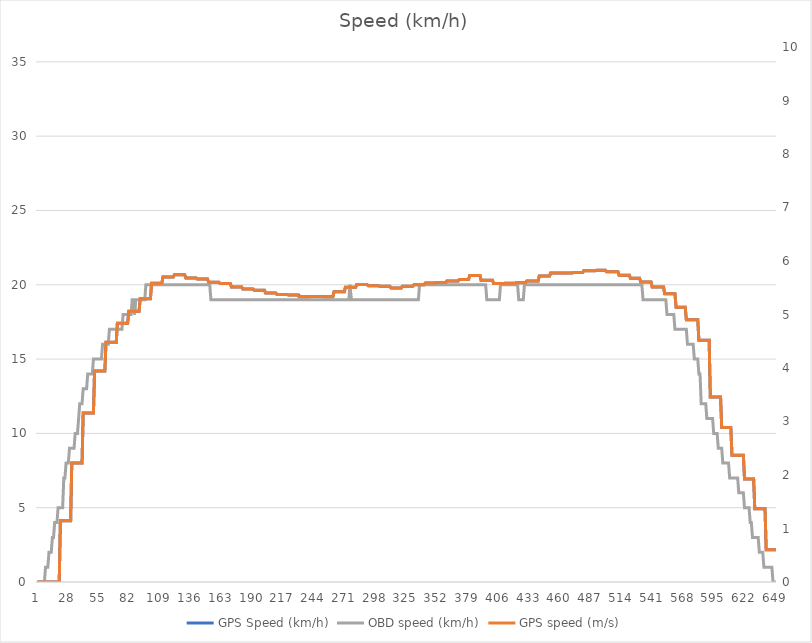
| Category | GPS Speed (km/h) | OBD speed (km/h) |
|---|---|---|
| 0 | 0 | 0 |
| 1 | 0 | 0 |
| 2 | 0 | 0 |
| 3 | 0 | 0 |
| 4 | 0 | 0 |
| 5 | 0 | 0 |
| 6 | 0 | 0 |
| 7 | 0 | 1 |
| 8 | 0 | 1 |
| 9 | 0 | 1 |
| 10 | 0 | 2 |
| 11 | 0 | 2 |
| 12 | 0 | 2 |
| 13 | 0 | 3 |
| 14 | 0 | 3 |
| 15 | 0 | 4 |
| 16 | 0 | 4 |
| 17 | 0 | 4 |
| 18 | 0 | 5 |
| 19 | 0 | 5 |
| 20 | 4.122 | 5 |
| 21 | 4.122 | 5 |
| 22 | 4.122 | 5 |
| 23 | 4.122 | 7 |
| 24 | 4.122 | 7 |
| 25 | 4.122 | 8 |
| 26 | 4.122 | 8 |
| 27 | 4.122 | 8 |
| 28 | 4.122 | 9 |
| 29 | 4.122 | 9 |
| 30 | 8.011 | 9 |
| 31 | 8.011 | 9 |
| 32 | 8.011 | 9 |
| 33 | 8.011 | 10 |
| 34 | 8.011 | 10 |
| 35 | 8.011 | 10 |
| 36 | 8.011 | 11 |
| 37 | 8.011 | 12 |
| 38 | 8.011 | 12 |
| 39 | 8.011 | 12 |
| 40 | 11.367 | 13 |
| 41 | 11.367 | 13 |
| 42 | 11.367 | 13 |
| 43 | 11.367 | 13 |
| 44 | 11.367 | 14 |
| 45 | 11.367 | 14 |
| 46 | 11.367 | 14 |
| 47 | 11.367 | 14 |
| 48 | 11.367 | 14 |
| 49 | 11.367 | 15 |
| 50 | 14.2 | 15 |
| 51 | 14.2 | 15 |
| 52 | 14.2 | 15 |
| 53 | 14.2 | 15 |
| 54 | 14.2 | 15 |
| 55 | 14.2 | 15 |
| 56 | 14.2 | 15 |
| 57 | 14.2 | 16 |
| 58 | 14.2 | 16 |
| 59 | 14.2 | 16 |
| 60 | 16.129 | 16 |
| 61 | 16.129 | 16 |
| 62 | 16.129 | 16 |
| 63 | 16.129 | 17 |
| 64 | 16.129 | 17 |
| 65 | 16.129 | 17 |
| 66 | 16.129 | 17 |
| 67 | 16.129 | 17 |
| 68 | 16.129 | 17 |
| 69 | 16.129 | 17 |
| 70 | 17.41 | 17 |
| 71 | 17.41 | 17 |
| 72 | 17.41 | 17 |
| 73 | 17.41 | 17 |
| 74 | 17.41 | 17 |
| 75 | 17.41 | 18 |
| 76 | 17.41 | 18 |
| 77 | 17.41 | 18 |
| 78 | 17.41 | 18 |
| 79 | 17.41 | 18 |
| 80 | 18.217 | 18 |
| 81 | 18.217 | 18 |
| 82 | 18.217 | 18 |
| 83 | 18.217 | 19 |
| 84 | 18.217 | 19 |
| 85 | 18.217 | 18 |
| 86 | 18.217 | 19 |
| 87 | 18.217 | 19 |
| 88 | 18.217 | 19 |
| 89 | 18.217 | 19 |
| 90 | 19.066 | 19 |
| 91 | 19.066 | 19 |
| 92 | 19.066 | 19 |
| 93 | 19.066 | 19 |
| 94 | 19.066 | 19 |
| 95 | 19.066 | 20 |
| 96 | 19.066 | 20 |
| 97 | 19.066 | 20 |
| 98 | 19.066 | 20 |
| 99 | 19.066 | 20 |
| 100 | 20.11 | 20 |
| 101 | 20.11 | 20 |
| 102 | 20.11 | 20 |
| 103 | 20.11 | 20 |
| 104 | 20.11 | 20 |
| 105 | 20.11 | 20 |
| 106 | 20.11 | 20 |
| 107 | 20.11 | 20 |
| 108 | 20.11 | 20 |
| 109 | 20.11 | 20 |
| 110 | 20.525 | 20 |
| 111 | 20.525 | 20 |
| 112 | 20.525 | 20 |
| 113 | 20.525 | 20 |
| 114 | 20.525 | 20 |
| 115 | 20.525 | 20 |
| 116 | 20.525 | 20 |
| 117 | 20.525 | 20 |
| 118 | 20.525 | 20 |
| 119 | 20.525 | 20 |
| 120 | 20.676 | 20 |
| 121 | 20.676 | 20 |
| 122 | 20.676 | 20 |
| 123 | 20.676 | 20 |
| 124 | 20.676 | 20 |
| 125 | 20.676 | 20 |
| 126 | 20.676 | 20 |
| 127 | 20.676 | 20 |
| 128 | 20.676 | 20 |
| 129 | 20.676 | 20 |
| 130 | 20.462 | 20 |
| 131 | 20.462 | 20 |
| 132 | 20.462 | 20 |
| 133 | 20.462 | 20 |
| 134 | 20.462 | 20 |
| 135 | 20.462 | 20 |
| 136 | 20.462 | 20 |
| 137 | 20.462 | 20 |
| 138 | 20.462 | 20 |
| 139 | 20.462 | 20 |
| 140 | 20.392 | 20 |
| 141 | 20.392 | 20 |
| 142 | 20.392 | 20 |
| 143 | 20.392 | 20 |
| 144 | 20.392 | 20 |
| 145 | 20.392 | 20 |
| 146 | 20.392 | 20 |
| 147 | 20.392 | 20 |
| 148 | 20.392 | 20 |
| 149 | 20.392 | 20 |
| 150 | 20.174 | 20 |
| 151 | 20.174 | 20 |
| 152 | 20.174 | 19 |
| 153 | 20.174 | 19 |
| 154 | 20.174 | 19 |
| 155 | 20.174 | 19 |
| 156 | 20.174 | 19 |
| 157 | 20.174 | 19 |
| 158 | 20.174 | 19 |
| 159 | 20.174 | 19 |
| 160 | 20.081 | 19 |
| 161 | 20.081 | 19 |
| 162 | 20.081 | 19 |
| 163 | 20.081 | 19 |
| 164 | 20.081 | 19 |
| 165 | 20.081 | 19 |
| 166 | 20.081 | 19 |
| 167 | 20.081 | 19 |
| 168 | 20.081 | 19 |
| 169 | 20.081 | 19 |
| 170 | 19.858 | 19 |
| 171 | 19.858 | 19 |
| 172 | 19.858 | 19 |
| 173 | 19.858 | 19 |
| 174 | 19.858 | 19 |
| 175 | 19.858 | 19 |
| 176 | 19.858 | 19 |
| 177 | 19.858 | 19 |
| 178 | 19.858 | 19 |
| 179 | 19.858 | 19 |
| 180 | 19.711 | 19 |
| 181 | 19.711 | 19 |
| 182 | 19.711 | 19 |
| 183 | 19.711 | 19 |
| 184 | 19.711 | 19 |
| 185 | 19.711 | 19 |
| 186 | 19.711 | 19 |
| 187 | 19.711 | 19 |
| 188 | 19.711 | 19 |
| 189 | 19.711 | 19 |
| 190 | 19.64 | 19 |
| 191 | 19.64 | 19 |
| 192 | 19.64 | 19 |
| 193 | 19.64 | 19 |
| 194 | 19.64 | 19 |
| 195 | 19.64 | 19 |
| 196 | 19.64 | 19 |
| 197 | 19.64 | 19 |
| 198 | 19.64 | 19 |
| 199 | 19.64 | 19 |
| 200 | 19.44 | 19 |
| 201 | 19.44 | 19 |
| 202 | 19.44 | 19 |
| 203 | 19.44 | 19 |
| 204 | 19.44 | 19 |
| 205 | 19.44 | 19 |
| 206 | 19.44 | 19 |
| 207 | 19.44 | 19 |
| 208 | 19.44 | 19 |
| 209 | 19.44 | 19 |
| 210 | 19.342 | 19 |
| 211 | 19.342 | 19 |
| 212 | 19.342 | 19 |
| 213 | 19.342 | 19 |
| 214 | 19.342 | 19 |
| 215 | 19.342 | 19 |
| 216 | 19.342 | 19 |
| 217 | 19.342 | 19 |
| 218 | 19.342 | 19 |
| 219 | 19.342 | 19 |
| 220 | 19.313 | 19 |
| 221 | 19.313 | 19 |
| 222 | 19.313 | 19 |
| 223 | 19.313 | 19 |
| 224 | 19.313 | 19 |
| 225 | 19.313 | 19 |
| 226 | 19.313 | 19 |
| 227 | 19.313 | 19 |
| 228 | 19.313 | 19 |
| 229 | 19.313 | 19 |
| 230 | 19.199 | 19 |
| 231 | 19.199 | 19 |
| 232 | 19.199 | 19 |
| 233 | 19.199 | 19 |
| 234 | 19.199 | 19 |
| 235 | 19.199 | 19 |
| 236 | 19.199 | 19 |
| 237 | 19.199 | 19 |
| 238 | 19.199 | 19 |
| 239 | 19.199 | 19 |
| 240 | 19.205 | 19 |
| 241 | 19.205 | 19 |
| 242 | 19.205 | 19 |
| 243 | 19.205 | 19 |
| 244 | 19.205 | 19 |
| 245 | 19.205 | 19 |
| 246 | 19.205 | 19 |
| 247 | 19.205 | 19 |
| 248 | 19.205 | 19 |
| 249 | 19.205 | 19 |
| 250 | 19.19 | 19 |
| 251 | 19.19 | 19 |
| 252 | 19.19 | 19 |
| 253 | 19.19 | 19 |
| 254 | 19.19 | 19 |
| 255 | 19.19 | 19 |
| 256 | 19.19 | 19 |
| 257 | 19.19 | 19 |
| 258 | 19.19 | 19 |
| 259 | 19.19 | 19 |
| 260 | 19.523 | 19 |
| 261 | 19.523 | 19 |
| 262 | 19.523 | 19 |
| 263 | 19.523 | 19 |
| 264 | 19.523 | 19 |
| 265 | 19.523 | 19 |
| 266 | 19.523 | 19 |
| 267 | 19.523 | 19 |
| 268 | 19.523 | 19 |
| 269 | 19.523 | 19 |
| 270 | 19.84 | 19 |
| 271 | 19.84 | 19 |
| 272 | 19.84 | 19 |
| 273 | 19.84 | 19 |
| 274 | 19.84 | 20 |
| 275 | 19.84 | 19 |
| 276 | 19.84 | 19 |
| 277 | 19.84 | 19 |
| 278 | 19.84 | 19 |
| 279 | 19.84 | 19 |
| 280 | 20.018 | 19 |
| 281 | 20.018 | 19 |
| 282 | 20.018 | 19 |
| 283 | 20.018 | 19 |
| 284 | 20.018 | 19 |
| 285 | 20.018 | 19 |
| 286 | 20.018 | 19 |
| 287 | 20.018 | 19 |
| 288 | 20.018 | 19 |
| 289 | 20.018 | 19 |
| 290 | 19.942 | 19 |
| 291 | 19.942 | 19 |
| 292 | 19.942 | 19 |
| 293 | 19.942 | 19 |
| 294 | 19.942 | 19 |
| 295 | 19.942 | 19 |
| 296 | 19.942 | 19 |
| 297 | 19.942 | 19 |
| 298 | 19.942 | 19 |
| 299 | 19.942 | 19 |
| 300 | 19.893 | 19 |
| 301 | 19.893 | 19 |
| 302 | 19.893 | 19 |
| 303 | 19.893 | 19 |
| 304 | 19.893 | 19 |
| 305 | 19.893 | 19 |
| 306 | 19.893 | 19 |
| 307 | 19.893 | 19 |
| 308 | 19.893 | 19 |
| 309 | 19.893 | 19 |
| 310 | 19.785 | 19 |
| 311 | 19.785 | 19 |
| 312 | 19.785 | 19 |
| 313 | 19.785 | 19 |
| 314 | 19.785 | 19 |
| 315 | 19.785 | 19 |
| 316 | 19.785 | 19 |
| 317 | 19.785 | 19 |
| 318 | 19.785 | 19 |
| 319 | 19.785 | 19 |
| 320 | 19.903 | 19 |
| 321 | 19.903 | 19 |
| 322 | 19.903 | 19 |
| 323 | 19.903 | 19 |
| 324 | 19.903 | 19 |
| 325 | 19.903 | 19 |
| 326 | 19.903 | 19 |
| 327 | 19.903 | 19 |
| 328 | 19.903 | 19 |
| 329 | 19.903 | 19 |
| 330 | 19.994 | 19 |
| 331 | 19.994 | 19 |
| 332 | 19.994 | 19 |
| 333 | 19.994 | 19 |
| 334 | 19.994 | 19 |
| 335 | 19.994 | 20 |
| 336 | 19.994 | 20 |
| 337 | 19.994 | 20 |
| 338 | 19.994 | 20 |
| 339 | 19.994 | 20 |
| 340 | 20.114 | 20 |
| 341 | 20.114 | 20 |
| 342 | 20.114 | 20 |
| 343 | 20.114 | 20 |
| 344 | 20.114 | 20 |
| 345 | 20.114 | 20 |
| 346 | 20.114 | 20 |
| 347 | 20.114 | 20 |
| 348 | 20.114 | 20 |
| 349 | 20.15 | 20 |
| 350 | 20.15 | 20 |
| 351 | 20.15 | 20 |
| 352 | 20.15 | 20 |
| 353 | 20.15 | 20 |
| 354 | 20.15 | 20 |
| 355 | 20.15 | 20 |
| 356 | 20.15 | 20 |
| 357 | 20.15 | 20 |
| 358 | 20.15 | 20 |
| 359 | 20.257 | 20 |
| 360 | 20.257 | 20 |
| 361 | 20.257 | 20 |
| 362 | 20.257 | 20 |
| 363 | 20.257 | 20 |
| 364 | 20.257 | 20 |
| 365 | 20.257 | 20 |
| 366 | 20.257 | 20 |
| 367 | 20.257 | 20 |
| 368 | 20.257 | 20 |
| 369 | 20.257 | 20 |
| 370 | 20.358 | 20 |
| 371 | 20.358 | 20 |
| 372 | 20.358 | 20 |
| 373 | 20.358 | 20 |
| 374 | 20.358 | 20 |
| 375 | 20.358 | 20 |
| 376 | 20.358 | 20 |
| 377 | 20.358 | 20 |
| 378 | 20.358 | 20 |
| 379 | 20.629 | 20 |
| 380 | 20.629 | 20 |
| 381 | 20.629 | 20 |
| 382 | 20.629 | 20 |
| 383 | 20.629 | 20 |
| 384 | 20.629 | 20 |
| 385 | 20.629 | 20 |
| 386 | 20.629 | 20 |
| 387 | 20.629 | 20 |
| 388 | 20.629 | 20 |
| 389 | 20.296 | 20 |
| 390 | 20.296 | 20 |
| 391 | 20.296 | 20 |
| 392 | 20.296 | 20 |
| 393 | 20.296 | 20 |
| 394 | 20.296 | 19 |
| 395 | 20.296 | 19 |
| 396 | 20.296 | 19 |
| 397 | 20.296 | 19 |
| 398 | 20.296 | 19 |
| 399 | 20.296 | 19 |
| 400 | 20.078 | 19 |
| 401 | 20.078 | 19 |
| 402 | 20.078 | 19 |
| 403 | 20.078 | 19 |
| 404 | 20.078 | 19 |
| 405 | 20.078 | 19 |
| 406 | 20.078 | 20 |
| 407 | 20.078 | 20 |
| 408 | 20.078 | 20 |
| 409 | 20.078 | 20 |
| 410 | 20.108 | 20 |
| 411 | 20.108 | 20 |
| 412 | 20.108 | 20 |
| 413 | 20.108 | 20 |
| 414 | 20.108 | 20 |
| 415 | 20.108 | 20 |
| 416 | 20.108 | 20 |
| 417 | 20.108 | 20 |
| 418 | 20.108 | 20 |
| 419 | 20.108 | 20 |
| 420 | 20.141 | 20 |
| 421 | 20.141 | 20 |
| 422 | 20.141 | 19 |
| 423 | 20.141 | 19 |
| 424 | 20.141 | 19 |
| 425 | 20.141 | 19 |
| 426 | 20.141 | 19 |
| 427 | 20.141 | 20 |
| 428 | 20.141 | 20 |
| 429 | 20.246 | 20 |
| 430 | 20.246 | 20 |
| 431 | 20.246 | 20 |
| 432 | 20.246 | 20 |
| 433 | 20.246 | 20 |
| 434 | 20.246 | 20 |
| 435 | 20.246 | 20 |
| 436 | 20.246 | 20 |
| 437 | 20.246 | 20 |
| 438 | 20.246 | 20 |
| 439 | 20.246 | 20 |
| 440 | 20.585 | 20 |
| 441 | 20.585 | 20 |
| 442 | 20.585 | 20 |
| 443 | 20.585 | 20 |
| 444 | 20.585 | 20 |
| 445 | 20.585 | 20 |
| 446 | 20.585 | 20 |
| 447 | 20.585 | 20 |
| 448 | 20.585 | 20 |
| 449 | 20.585 | 20 |
| 450 | 20.793 | 20 |
| 451 | 20.793 | 20 |
| 452 | 20.793 | 20 |
| 453 | 20.793 | 20 |
| 454 | 20.793 | 20 |
| 455 | 20.793 | 20 |
| 456 | 20.793 | 20 |
| 457 | 20.793 | 20 |
| 458 | 20.793 | 20 |
| 459 | 20.799 | 20 |
| 460 | 20.799 | 20 |
| 461 | 20.799 | 20 |
| 462 | 20.799 | 20 |
| 463 | 20.799 | 20 |
| 464 | 20.799 | 20 |
| 465 | 20.799 | 20 |
| 466 | 20.799 | 20 |
| 467 | 20.799 | 20 |
| 468 | 20.799 | 20 |
| 469 | 20.799 | 20 |
| 470 | 20.82 | 20 |
| 471 | 20.82 | 20 |
| 472 | 20.82 | 20 |
| 473 | 20.82 | 20 |
| 474 | 20.82 | 20 |
| 475 | 20.82 | 20 |
| 476 | 20.82 | 20 |
| 477 | 20.82 | 20 |
| 478 | 20.82 | 20 |
| 479 | 20.946 | 20 |
| 480 | 20.946 | 20 |
| 481 | 20.946 | 20 |
| 482 | 20.946 | 20 |
| 483 | 20.946 | 20 |
| 484 | 20.946 | 20 |
| 485 | 20.946 | 20 |
| 486 | 20.946 | 20 |
| 487 | 20.946 | 20 |
| 488 | 20.946 | 20 |
| 489 | 20.946 | 20 |
| 490 | 20.976 | 20 |
| 491 | 20.976 | 20 |
| 492 | 20.976 | 20 |
| 493 | 20.976 | 20 |
| 494 | 20.976 | 20 |
| 495 | 20.976 | 20 |
| 496 | 20.976 | 20 |
| 497 | 20.976 | 20 |
| 498 | 20.976 | 20 |
| 499 | 20.879 | 20 |
| 500 | 20.879 | 20 |
| 501 | 20.879 | 20 |
| 502 | 20.879 | 20 |
| 503 | 20.879 | 20 |
| 504 | 20.879 | 20 |
| 505 | 20.879 | 20 |
| 506 | 20.879 | 20 |
| 507 | 20.879 | 20 |
| 508 | 20.879 | 20 |
| 509 | 20.879 | 20 |
| 510 | 20.645 | 20 |
| 511 | 20.645 | 20 |
| 512 | 20.645 | 20 |
| 513 | 20.645 | 20 |
| 514 | 20.645 | 20 |
| 515 | 20.645 | 20 |
| 516 | 20.645 | 20 |
| 517 | 20.645 | 20 |
| 518 | 20.645 | 20 |
| 519 | 20.645 | 20 |
| 520 | 20.433 | 20 |
| 521 | 20.433 | 20 |
| 522 | 20.433 | 20 |
| 523 | 20.433 | 20 |
| 524 | 20.433 | 20 |
| 525 | 20.433 | 20 |
| 526 | 20.433 | 20 |
| 527 | 20.433 | 20 |
| 528 | 20.433 | 20 |
| 529 | 20.184 | 20 |
| 530 | 20.184 | 20 |
| 531 | 20.184 | 19 |
| 532 | 20.184 | 19 |
| 533 | 20.184 | 19 |
| 534 | 20.184 | 19 |
| 535 | 20.184 | 19 |
| 536 | 20.184 | 19 |
| 537 | 20.184 | 19 |
| 538 | 20.184 | 19 |
| 539 | 19.854 | 19 |
| 540 | 19.854 | 19 |
| 541 | 19.854 | 19 |
| 542 | 19.854 | 19 |
| 543 | 19.854 | 19 |
| 544 | 19.854 | 19 |
| 545 | 19.854 | 19 |
| 546 | 19.854 | 19 |
| 547 | 19.854 | 19 |
| 548 | 19.854 | 19 |
| 549 | 19.854 | 19 |
| 550 | 19.393 | 19 |
| 551 | 19.393 | 19 |
| 552 | 19.393 | 18 |
| 553 | 19.393 | 18 |
| 554 | 19.393 | 18 |
| 555 | 19.393 | 18 |
| 556 | 19.393 | 18 |
| 557 | 19.393 | 18 |
| 558 | 19.393 | 18 |
| 559 | 19.393 | 17 |
| 560 | 18.493 | 17 |
| 561 | 18.493 | 17 |
| 562 | 18.493 | 17 |
| 563 | 18.493 | 17 |
| 564 | 18.493 | 17 |
| 565 | 18.493 | 17 |
| 566 | 18.493 | 17 |
| 567 | 18.493 | 17 |
| 568 | 18.493 | 17 |
| 569 | 17.646 | 17 |
| 570 | 17.646 | 16 |
| 571 | 17.646 | 16 |
| 572 | 17.646 | 16 |
| 573 | 17.646 | 16 |
| 574 | 17.646 | 16 |
| 575 | 17.646 | 16 |
| 576 | 17.646 | 15 |
| 577 | 17.646 | 15 |
| 578 | 17.646 | 15 |
| 579 | 17.646 | 15 |
| 580 | 16.265 | 14 |
| 581 | 16.265 | 14 |
| 582 | 16.265 | 12 |
| 583 | 16.265 | 12 |
| 584 | 16.265 | 12 |
| 585 | 16.265 | 12 |
| 586 | 16.265 | 12 |
| 587 | 16.265 | 11 |
| 588 | 16.265 | 11 |
| 589 | 16.265 | 11 |
| 590 | 12.453 | 11 |
| 591 | 12.453 | 11 |
| 592 | 12.453 | 11 |
| 593 | 12.453 | 10 |
| 594 | 12.453 | 10 |
| 595 | 12.453 | 10 |
| 596 | 12.453 | 10 |
| 597 | 12.453 | 9 |
| 598 | 12.453 | 9 |
| 599 | 12.453 | 9 |
| 600 | 10.403 | 9 |
| 601 | 10.403 | 8 |
| 602 | 10.403 | 8 |
| 603 | 10.403 | 8 |
| 604 | 10.403 | 8 |
| 605 | 10.403 | 8 |
| 606 | 10.403 | 8 |
| 607 | 10.403 | 7 |
| 608 | 10.403 | 7 |
| 609 | 8.537 | 7 |
| 610 | 8.537 | 7 |
| 611 | 8.537 | 7 |
| 612 | 8.537 | 7 |
| 613 | 8.537 | 7 |
| 614 | 8.537 | 7 |
| 615 | 8.537 | 6 |
| 616 | 8.537 | 6 |
| 617 | 8.537 | 6 |
| 618 | 8.537 | 6 |
| 619 | 8.537 | 6 |
| 620 | 6.935 | 5 |
| 621 | 6.935 | 5 |
| 622 | 6.935 | 5 |
| 623 | 6.935 | 5 |
| 624 | 6.935 | 5 |
| 625 | 6.935 | 4 |
| 626 | 6.935 | 4 |
| 627 | 6.935 | 3 |
| 628 | 6.935 | 3 |
| 629 | 4.932 | 3 |
| 630 | 4.932 | 3 |
| 631 | 4.932 | 3 |
| 632 | 4.932 | 3 |
| 633 | 4.932 | 2 |
| 634 | 4.932 | 2 |
| 635 | 4.932 | 2 |
| 636 | 4.932 | 2 |
| 637 | 4.932 | 1 |
| 638 | 4.932 | 1 |
| 639 | 2.165 | 1 |
| 640 | 2.165 | 1 |
| 641 | 2.165 | 1 |
| 642 | 2.165 | 1 |
| 643 | 2.165 | 1 |
| 644 | 2.165 | 1 |
| 645 | 2.165 | 0 |
| 646 | 2.165 | 0 |
| 647 | 2.165 | 0 |
| 648 | 2.165 | 0 |